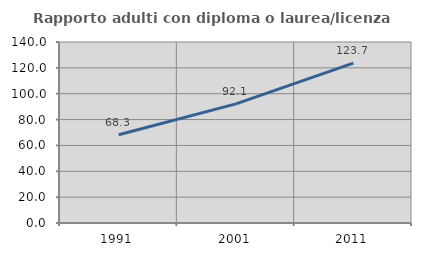
| Category | Rapporto adulti con diploma o laurea/licenza media  |
|---|---|
| 1991.0 | 68.261 |
| 2001.0 | 92.131 |
| 2011.0 | 123.718 |